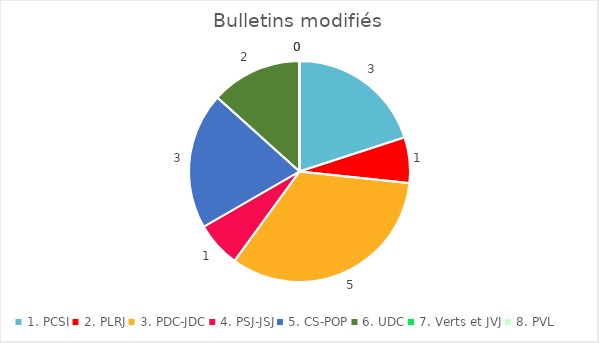
| Category | Series 0 |
|---|---|
| 1. PCSI | 3 |
| 2. PLRJ | 1 |
| 3. PDC-JDC | 5 |
| 4. PSJ-JSJ | 1 |
| 5. CS-POP | 3 |
| 6. UDC | 2 |
| 7. Verts et JVJ | 0 |
| 8. PVL | 0 |